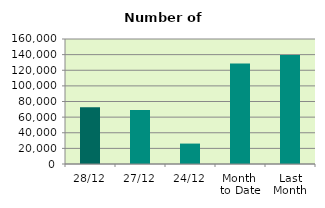
| Category | Series 0 |
|---|---|
| 28/12 | 72568 |
| 27/12 | 69110 |
| 24/12 | 26140 |
| Month 
to Date | 128665.4 |
| Last
Month | 139642.182 |